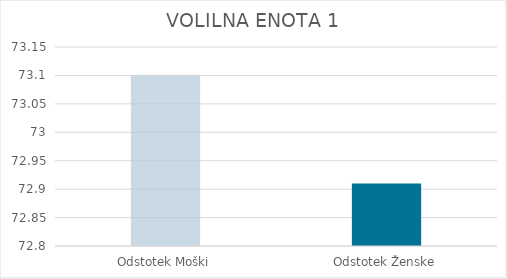
| Category | Series 0 |
|---|---|
| Odstotek Moški | 73.1 |
| Odstotek Ženske | 72.91 |